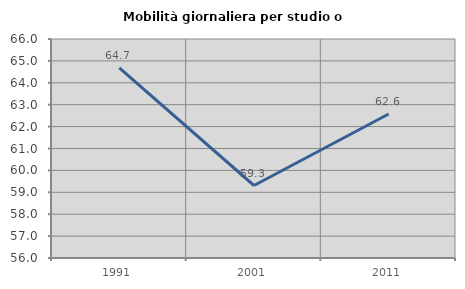
| Category | Mobilità giornaliera per studio o lavoro |
|---|---|
| 1991.0 | 64.687 |
| 2001.0 | 59.31 |
| 2011.0 | 62.576 |